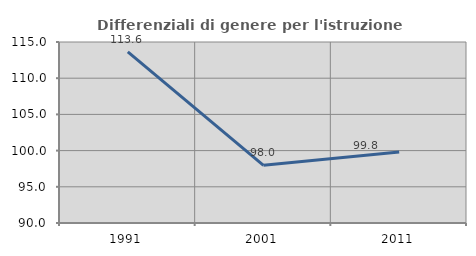
| Category | Differenziali di genere per l'istruzione superiore |
|---|---|
| 1991.0 | 113.643 |
| 2001.0 | 97.971 |
| 2011.0 | 99.798 |